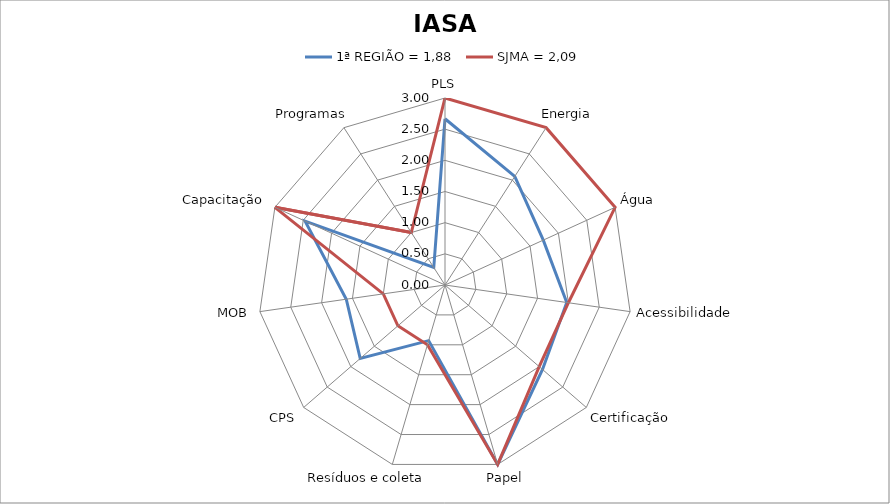
| Category | 1ª REGIÃO = 1,88 | SJMA = 2,09 |
|---|---|---|
| PLS | 2.667 | 3 |
| Energia | 2.07 | 3 |
| Água | 1.733 | 3 |
| Acessibilidade | 1.973 | 2 |
| Certificação | 2.07 | 2 |
| Papel | 3 | 3 |
| Resíduos e coleta | 0.93 | 1 |
| CPS | 1.8 | 1 |
| MOB | 1.6 | 1 |
| Capacitação | 2.467 | 3 |
| Programas | 0.333 | 1 |